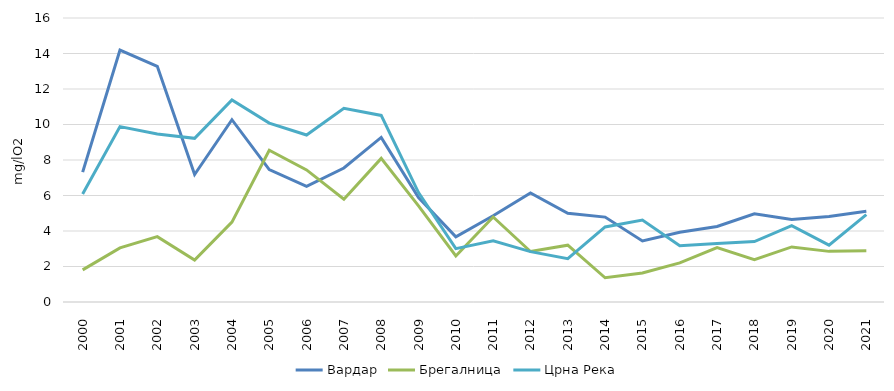
| Category | Вардар | Брегалница | Црна Река |
|---|---|---|---|
| 2000.0 | 7.32 | 1.81 | 6.09 |
| 2001.0 | 14.19 | 3.05 | 9.88 |
| 2002.0 | 13.28 | 3.68 | 9.47 |
| 2003.0 | 7.18 | 2.36 | 9.22 |
| 2004.0 | 10.27 | 4.5 | 11.38 |
| 2005.0 | 7.46 | 8.55 | 10.08 |
| 2006.0 | 6.52 | 7.44 | 9.41 |
| 2007.0 | 7.55 | 5.79 | 10.91 |
| 2008.0 | 9.27 | 8.09 | 10.51 |
| 2009.0 | 5.883 | 5.415 | 6.163 |
| 2010.0 | 3.675 | 2.596 | 3.005 |
| 2011.0 | 4.859 | 4.789 | 3.444 |
| 2012.0 | 6.145 | 2.846 | 2.839 |
| 2013.0 | 4.997 | 3.201 | 2.441 |
| 2014.0 | 4.783 | 1.364 | 4.228 |
| 2015.0 | 3.441 | 1.63 | 4.614 |
| 2016.0 | 3.931 | 2.201 | 3.168 |
| 2017.0 | 4.258 | 3.063 | 3.296 |
| 2018.0 | 4.969 | 2.391 | 3.403 |
| 2019.0 | 4.647 | 3.103 | 4.299 |
| 2020.0 | 4.819 | 2.852 | 3.206 |
| 2021.0 | 5.107 | 2.882 | 4.926 |